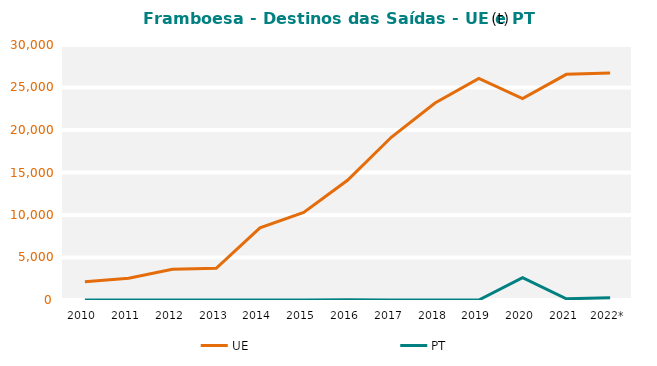
| Category | UE | PT |
|---|---|---|
| 2010 | 2143.872 | 0.084 |
| 2011 | 2553.363 | 0.185 |
| 2012 | 3627.892 | 0.189 |
| 2013 | 3735.355 | 2.226 |
| 2014 | 8487.301 | 5.247 |
| 2015 | 10296.337 | 5.763 |
| 2016 | 14087.655 | 19.019 |
| 2017 | 19142.36 | 2.297 |
| 2018 | 23168.828 | 4.243 |
| 2019 | 26077.828 | 0.973 |
| 2020 | 23690.85 | 2634.385 |
| 2021 | 26548.664 | 144.056 |
| 2022* | 26695.972 | 262.265 |